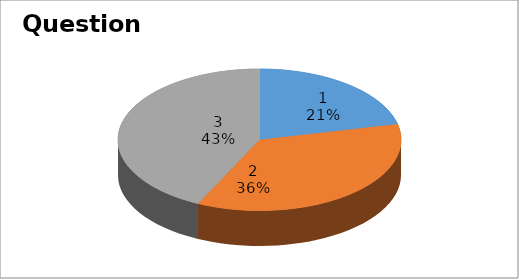
| Category | Series 0 |
|---|---|
| 0 | 3 |
| 1 | 5 |
| 2 | 6 |